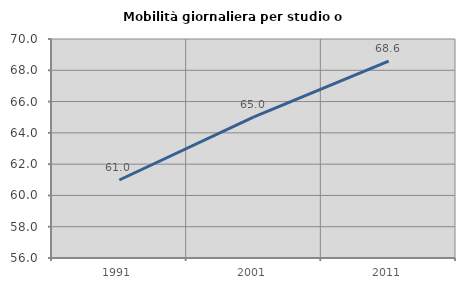
| Category | Mobilità giornaliera per studio o lavoro |
|---|---|
| 1991.0 | 60.987 |
| 2001.0 | 65.02 |
| 2011.0 | 68.58 |